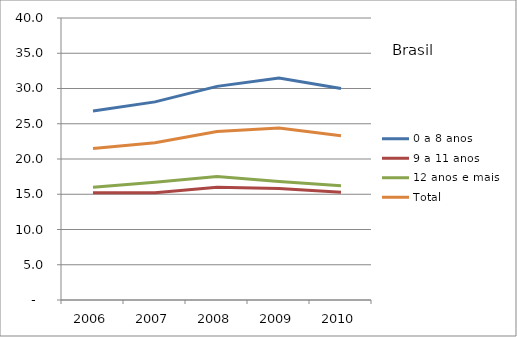
| Category | 0 a 8 anos | 9 a 11 anos | 12 anos e mais | Total |
|---|---|---|---|---|
| 2006.0 | 26.8 | 15.2 | 16 | 21.5 |
| 2007.0 | 28.1 | 15.2 | 16.7 | 22.3 |
| 2008.0 | 30.3 | 16 | 17.5 | 23.9 |
| 2009.0 | 31.5 | 15.8 | 16.8 | 24.4 |
| 2010.0 | 30 | 15.3 | 16.2 | 23.3 |